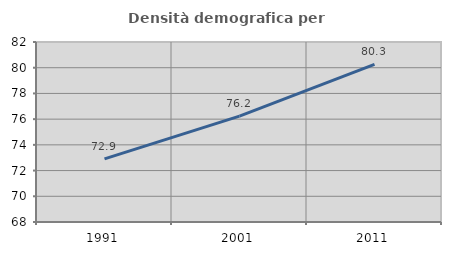
| Category | Densità demografica |
|---|---|
| 1991.0 | 72.905 |
| 2001.0 | 76.231 |
| 2011.0 | 80.256 |